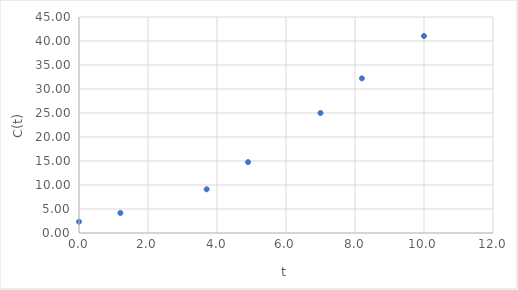
| Category | Series 0 |
|---|---|
| 0.0 | 2.35 |
| 1.2 | 4.18 |
| 3.7 | 9.11 |
| 4.9 | 14.77 |
| 7.0 | 25 |
| 8.2 | 32.22 |
| 10.0 | 41.05 |